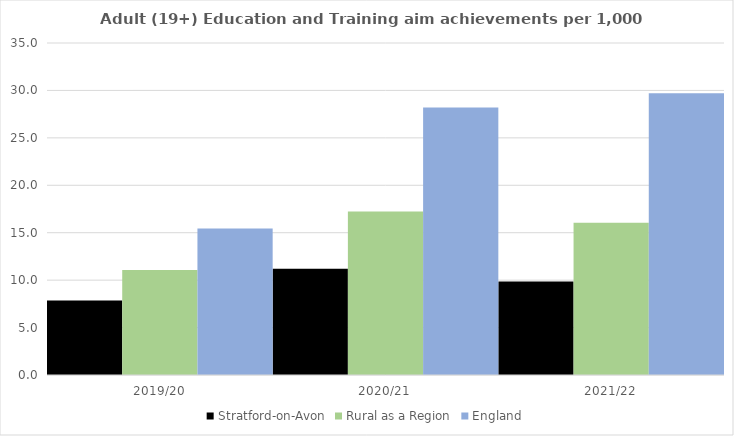
| Category | Stratford-on-Avon | Rural as a Region | England |
|---|---|---|---|
| 2019/20 | 7.862 | 11.081 | 15.446 |
| 2020/21 | 11.203 | 17.224 | 28.211 |
| 2021/22 | 9.854 | 16.063 | 29.711 |